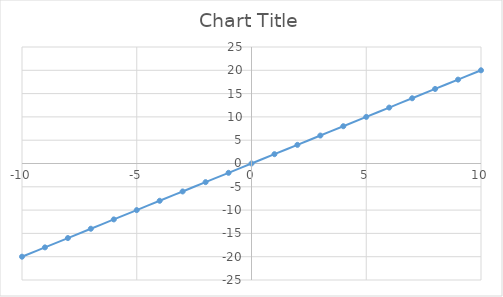
| Category | Series 0 |
|---|---|
| -10.0 | -20 |
| -9.0 | -18 |
| -8.0 | -16 |
| -7.0 | -14 |
| -6.0 | -12 |
| -5.0 | -10 |
| -4.0 | -8 |
| -3.0 | -6 |
| -2.0 | -4 |
| -1.0 | -2 |
| 0.0 | 0 |
| 1.0 | 2 |
| 2.0 | 4 |
| 3.0 | 6 |
| 4.0 | 8 |
| 5.0 | 10 |
| 6.0 | 12 |
| 7.0 | 14 |
| 8.0 | 16 |
| 9.0 | 18 |
| 10.0 | 20 |